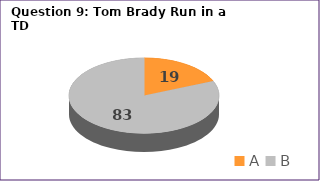
| Category | Series 0 |
|---|---|
| A | 19 |
| B | 83 |